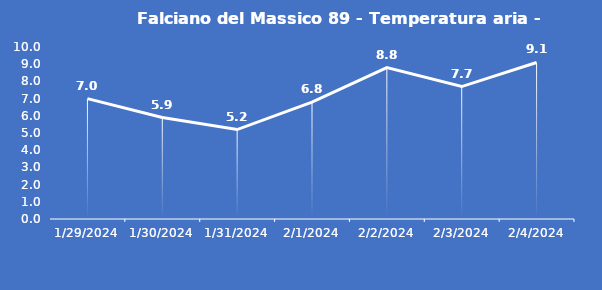
| Category | Falciano del Massico 89 - Temperatura aria - Grezzo (°C) |
|---|---|
| 1/29/24 | 7 |
| 1/30/24 | 5.9 |
| 1/31/24 | 5.2 |
| 2/1/24 | 6.8 |
| 2/2/24 | 8.8 |
| 2/3/24 | 7.7 |
| 2/4/24 | 9.1 |